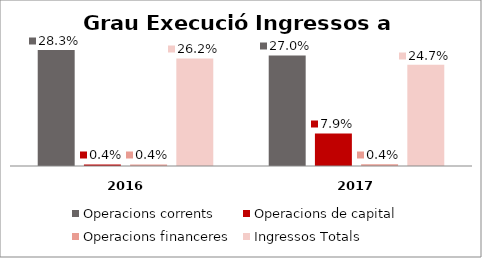
| Category | Operacions corrents | Operacions de capital | Operacions financeres | Ingressos Totals |
|---|---|---|---|---|
| 0 | 0.283 | 0.004 | 0.004 | 0.262 |
| 1 | 0.27 | 0.079 | 0.004 | 0.247 |